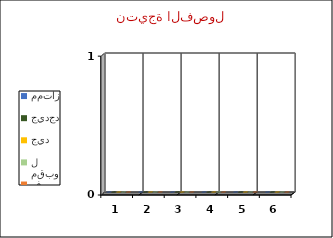
| Category | ممتاز | جيدجدا | جيد | مقبول | ضعيف |
|---|---|---|---|---|---|
| 0 | 0 | 0 | 0 | 0 | 0 |
| 1 | 0 | 0 | 0 | 0 | 0 |
| 2 | 0 | 0 | 0 | 0 | 0 |
| 3 | 0 | 0 | 0 | 0 | 0 |
| 4 | 0 | 0 | 0 | 0 | 0 |
| 5 | 0 | 0 | 0 | 0 | 0 |